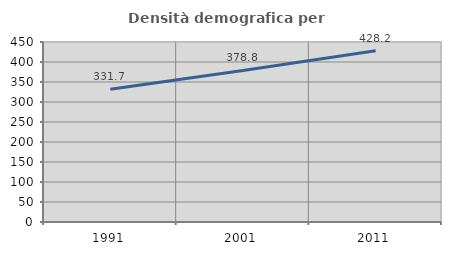
| Category | Densità demografica |
|---|---|
| 1991.0 | 331.696 |
| 2001.0 | 378.83 |
| 2011.0 | 428.166 |